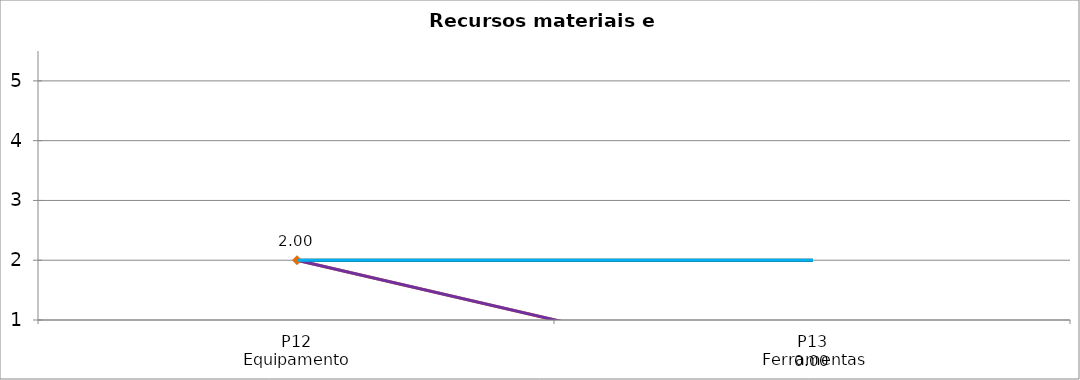
| Category | Valoración (1-5) | MEDIA |
|---|---|---|
| P12
Equipamento | 2 | 2 |
| P13
Ferramentas | 0 | 2 |